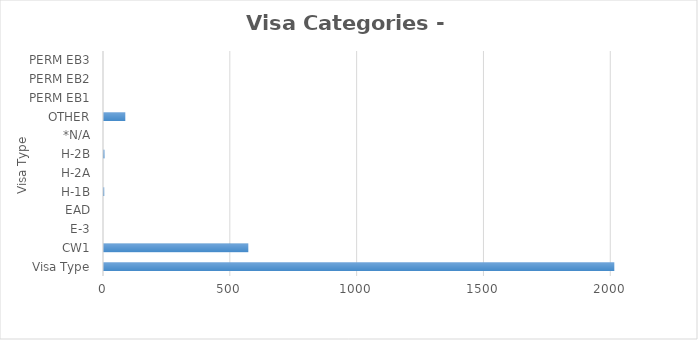
| Category | Series 0 |
|---|---|
| Visa Type | 2012 |
| CW1 | 569 |
| E-3 | 0 |
| EAD | 0 |
| H-1B | 1 |
| H-2A | 0 |
| H-2B | 2 |
| *N/A | 0 |
| OTHER | 84 |
| PERM EB1 | 0 |
| PERM EB2 | 0 |
| PERM EB3 | 0 |